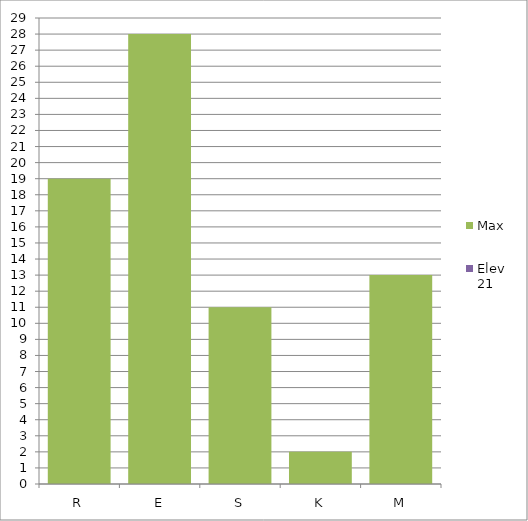
| Category | Max | Elev 21 |
|---|---|---|
| R | 19 | 0 |
| E | 28 | 0 |
| S | 11 | 0 |
| K | 2 | 0 |
| M | 13 | 0 |